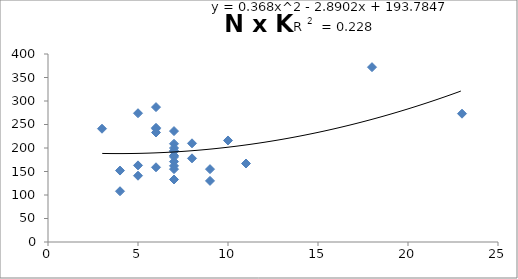
| Category | Series 0 |
|---|---|
| 7.0 | 236 |
| 8.0 | 210 |
| 7.0 | 200 |
| 7.0 | 181 |
| 7.0 | 171 |
| 6.0 | 287 |
| 6.0 | 241 |
| 3.0 | 241 |
| 4.0 | 108 |
| 9.0 | 130 |
| 7.0 | 162 |
| 7.0 | 209 |
| 6.0 | 233 |
| 6.0 | 243 |
| 10.0 | 216 |
| 5.0 | 163 |
| 18.0 | 372 |
| 23.0 | 273 |
| 11.0 | 167 |
| 7.0 | 133 |
| 7.0 | 155 |
| 8.0 | 178 |
| 7.0 | 193 |
| 5.0 | 274 |
| 9.0 | 155 |
| 5.0 | 141 |
| 7.0 | 194 |
| 7.0 | 184 |
| 4.0 | 152 |
| 6.0 | 159 |